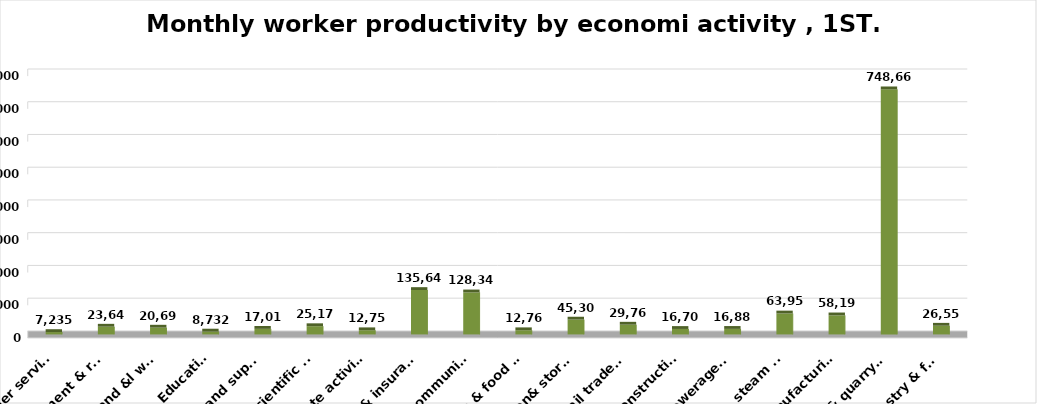
| Category | إنتاجية المشتغل  |
|---|---|
| Agriculture, forestry & fishing | 26556 |
| Mining & quarrying | 748668 |
| Manufacturing | 58190 |
| Electricity, gas, steam & air conditioning supply | 63952 |
| Water supply; sewerage, waste remediation  | 16883 |
| Construction | 16704 |
| Wholesale& retail trade; repair of motor vehicles | 29769 |
| Transportation& storage | 45302 |
| Accommodation & food service activities | 12760 |
| Information & communication | 128344 |
| Financial & insurance | 135649 |
| Real estate activities | 12750 |
| Professional, scientific & technical activities | 25178 |
| Administrative and support service activities | 17019 |
| Education | 8732 |
| Human health and &l work activities | 20695 |
| Arts, entertainment & recreation | 23643 |
| Other service | 7235 |